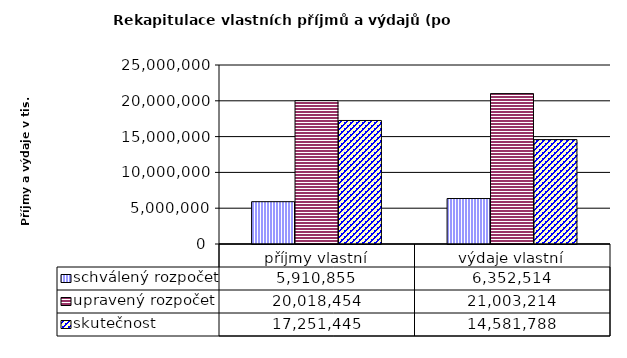
| Category | schválený rozpočet | upravený rozpočet | skutečnost |
|---|---|---|---|
| příjmy vlastní | 5910855 | 20018454 | 17251445 |
| výdaje vlastní | 6352514 | 21003214 | 14581788 |